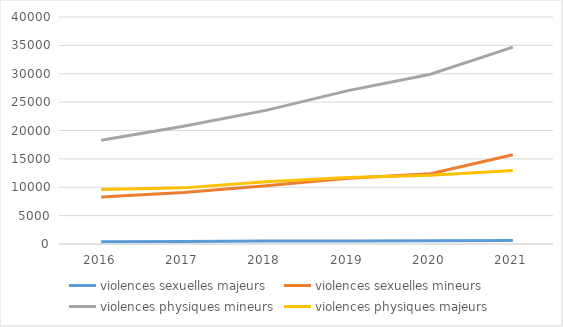
| Category | violences sexuelles majeurs | violences sexuelles mineurs | violences physiques mineurs | violences physiques majeurs |
|---|---|---|---|---|
| 2016.0 | 414 | 8262 | 18279 | 9616 |
| 2017.0 | 439 | 9080 | 20758 | 9890 |
| 2018.0 | 543 | 10258 | 23550 | 10950 |
| 2019.0 | 546 | 11598 | 27030 | 11713 |
| 2020.0 | 567 | 12379 | 29921 | 12101 |
| 2021.0 | 633 | 15731 | 34683 | 12937 |